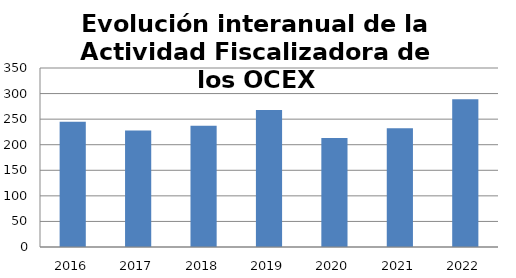
| Category | Series 0 |
|---|---|
| 2016.0 | 245 |
| 2017.0 | 228 |
| 2018.0 | 237 |
| 2019.0 | 268 |
| 2020.0 | 213 |
| 2021.0 | 232 |
| 2022.0 | 289 |